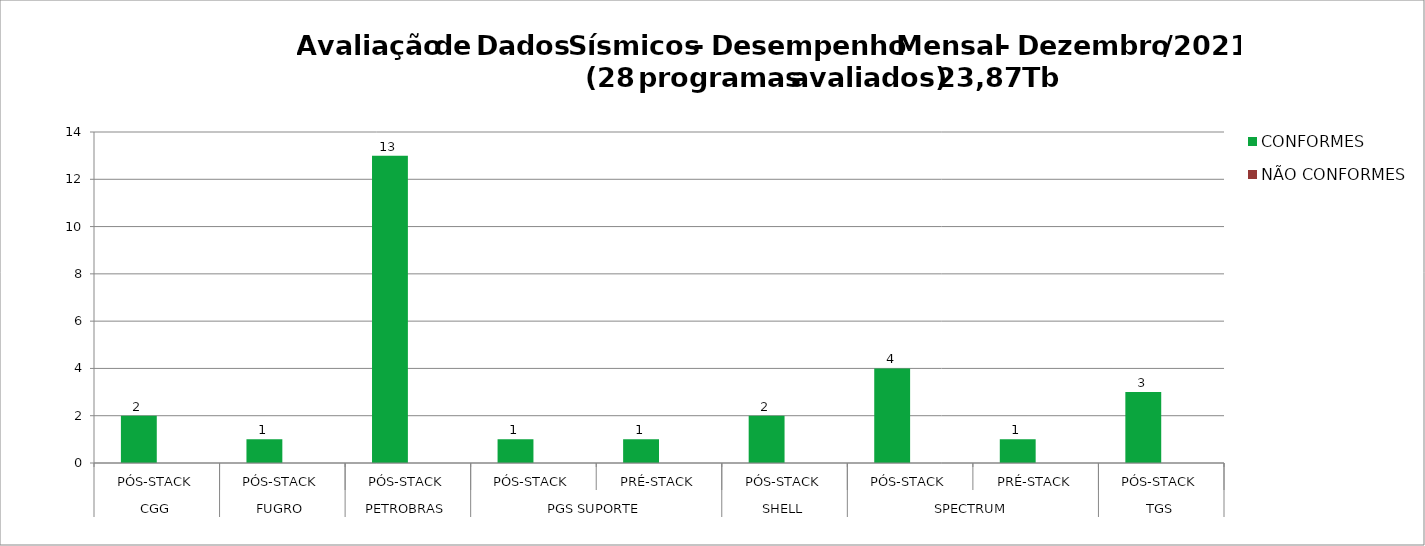
| Category | CONFORMES | NÃO CONFORMES |
|---|---|---|
| 0 | 2 |  |
| 1 | 1 |  |
| 2 | 13 |  |
| 3 | 1 |  |
| 4 | 1 |  |
| 5 | 2 |  |
| 6 | 4 |  |
| 7 | 1 |  |
| 8 | 3 |  |